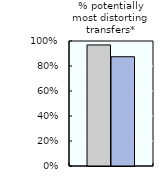
| Category | 2000-02 | 2016-18 |
|---|---|---|
| % potentially most distorting transfers* | 0.969 | 0.874 |